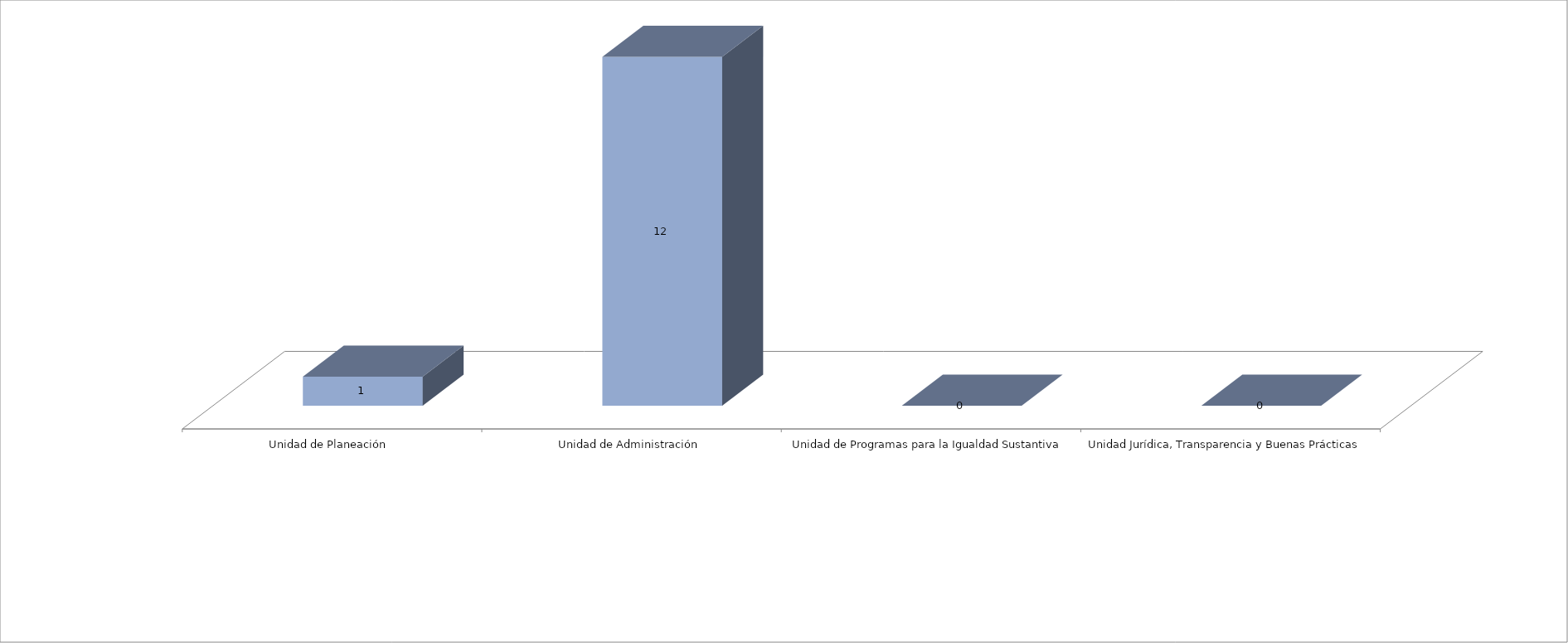
| Category | Series 0 | Series 1 |
|---|---|---|
| Unidad de Planeación  |  | 1 |
| Unidad de Administración |  | 12 |
| Unidad de Programas para la Igualdad Sustantiva |  | 0 |
| Unidad Jurídica, Transparencia y Buenas Prácticas  |  | 0 |